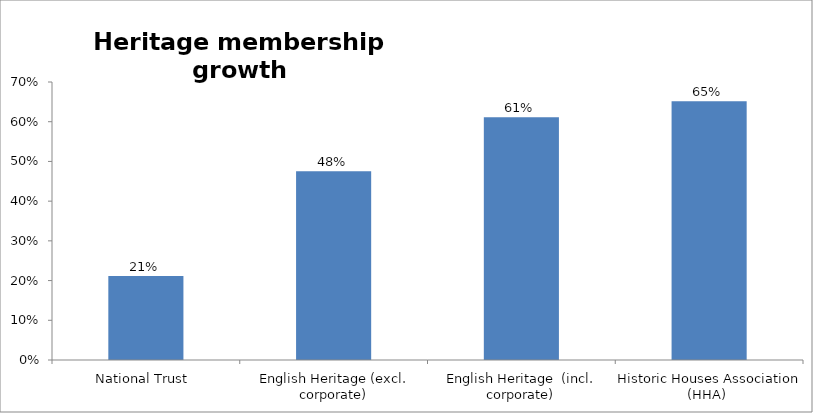
| Category | Series 0 |
|---|---|
| National Trust  | 0.212 |
| English Heritage (excl. corporate) | 0.475 |
| English Heritage  (incl. corporate) | 0.612 |
| Historic Houses Association (HHA)  | 0.652 |